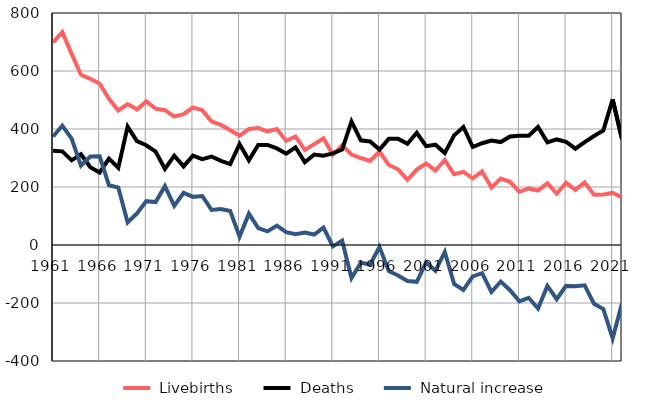
| Category |  Livebirths |  Deaths |  Natural increase |
|---|---|---|---|
| 1961.0 | 699 | 325 | 374 |
| 1962.0 | 734 | 323 | 411 |
| 1963.0 | 659 | 292 | 367 |
| 1964.0 | 587 | 313 | 274 |
| 1965.0 | 573 | 268 | 305 |
| 1966.0 | 556 | 250 | 306 |
| 1967.0 | 504 | 298 | 206 |
| 1968.0 | 464 | 266 | 198 |
| 1969.0 | 486 | 408 | 78 |
| 1970.0 | 467 | 358 | 109 |
| 1971.0 | 495 | 344 | 151 |
| 1972.0 | 470 | 322 | 148 |
| 1973.0 | 465 | 262 | 203 |
| 1974.0 | 443 | 308 | 135 |
| 1975.0 | 451 | 271 | 180 |
| 1976.0 | 474 | 308 | 166 |
| 1977.0 | 465 | 296 | 169 |
| 1978.0 | 426 | 305 | 121 |
| 1979.0 | 414 | 290 | 124 |
| 1980.0 | 396 | 279 | 117 |
| 1981.0 | 377 | 348 | 29 |
| 1982.0 | 400 | 292 | 108 |
| 1983.0 | 403 | 345 | 58 |
| 1984.0 | 392 | 345 | 47 |
| 1985.0 | 400 | 333 | 67 |
| 1986.0 | 359 | 315 | 44 |
| 1987.0 | 374 | 337 | 37 |
| 1988.0 | 328 | 285 | 43 |
| 1989.0 | 348 | 312 | 36 |
| 1990.0 | 368 | 308 | 60 |
| 1991.0 | 311 | 316 | -5 |
| 1992.0 | 344 | 329 | 15 |
| 1993.0 | 312 | 426 | -114 |
| 1994.0 | 300 | 361 | -61 |
| 1995.0 | 290 | 357 | -67 |
| 1996.0 | 322 | 329 | -7 |
| 1997.0 | 276 | 366 | -90 |
| 1998.0 | 261 | 366 | -105 |
| 1999.0 | 225 | 349 | -124 |
| 2000.0 | 260 | 387 | -127 |
| 2001.0 | 281 | 341 | -60 |
| 2002.0 | 257 | 346 | -89 |
| 2003.0 | 293 | 317 | -24 |
| 2004.0 | 244 | 378 | -134 |
| 2005.0 | 252 | 407 | -155 |
| 2006.0 | 230 | 338 | -108 |
| 2007.0 | 254 | 351 | -97 |
| 2008.0 | 198 | 360 | -162 |
| 2009.0 | 229 | 355 | -126 |
| 2010.0 | 218 | 374 | -156 |
| 2011.0 | 183 | 377 | -194 |
| 2012.0 | 195 | 377 | -182 |
| 2013.0 | 188 | 407 | -219 |
| 2014.0 | 213 | 354 | -141 |
| 2015.0 | 177 | 364 | -187 |
| 2016.0 | 215 | 356 | -141 |
| 2017.0 | 190 | 332 | -142 |
| 2018.0 | 216 | 355 | -139 |
| 2019.0 | 173 | 376 | -203 |
| 2020.0 | 174 | 395 | -221 |
| 2021.0 | 180 | 502 | -322 |
| 2022.0 | 164 | 365 | -201 |